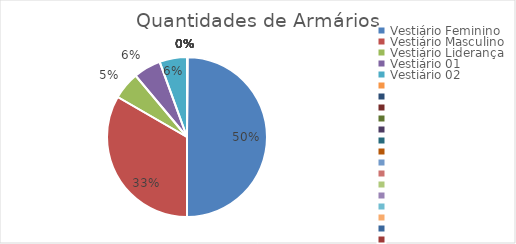
| Category | Quantidades de Armários |
|---|---|
| Vestiário Feminino | 9 |
| Vestiário Masculino | 6 |
| Vestiário Liderança | 1 |
| Vestiário 01 | 1 |
| Vestiário 02 | 1 |